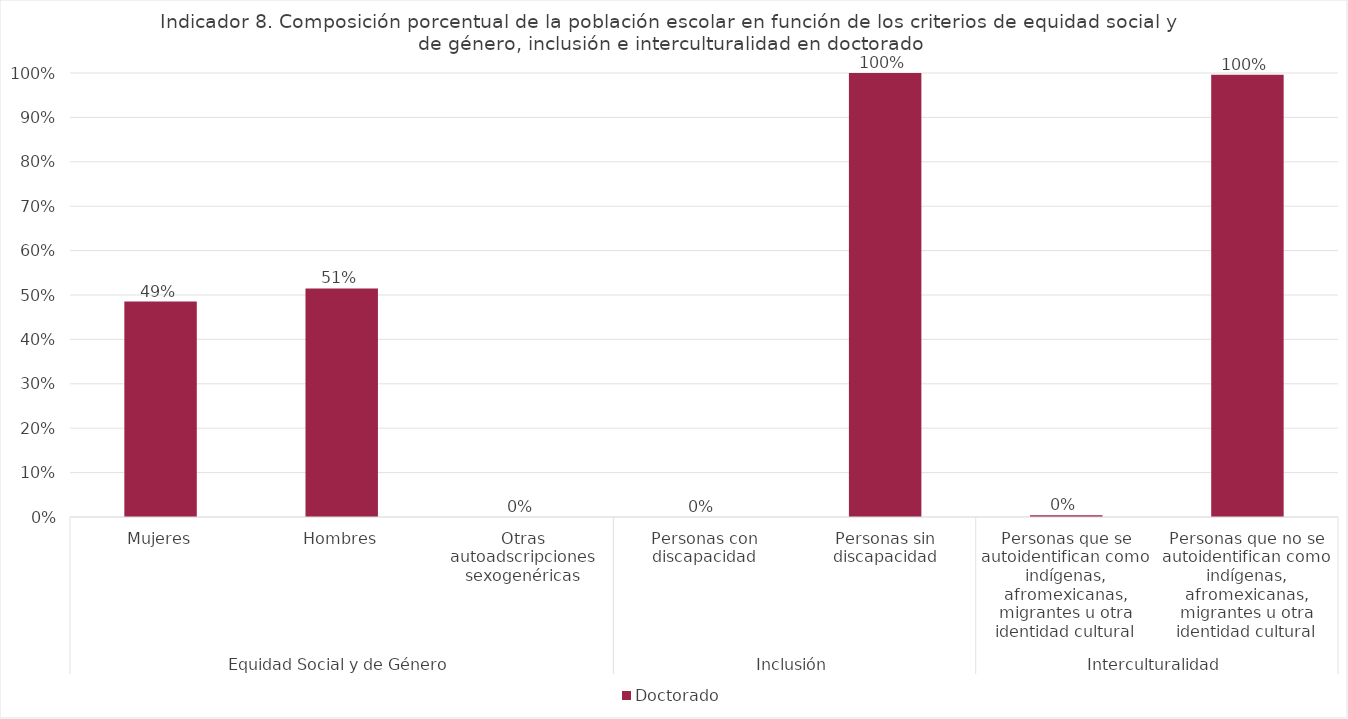
| Category | Doctorado |
|---|---|
| 0 | 0.485 |
| 1 | 0.515 |
| 2 | 0 |
| 3 | 0 |
| 4 | 1 |
| 5 | 0.004 |
| 6 | 0.996 |